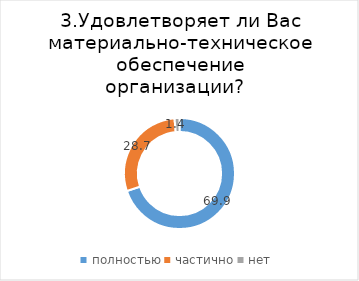
| Category | Series 0 |
|---|---|
| полностью | 69.892 |
| частично | 28.674 |
| нет | 1.434 |